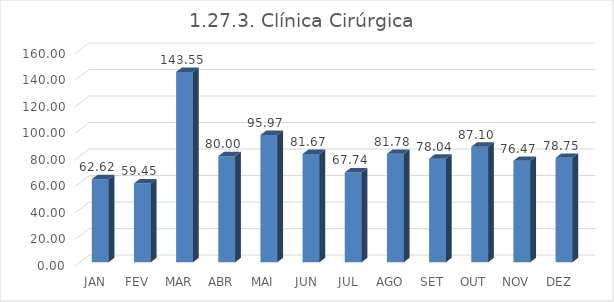
| Category | 1.27.3. Clínica Cirúrgica  |
|---|---|
|  JAN  | 62.619 |
|  FEV  | 59.454 |
|  MAR  | 143.548 |
|  ABR  | 80 |
|  MAI  | 95.968 |
|  JUN  | 81.667 |
|  JUL  | 67.742 |
|  AGO  | 81.784 |
|  SET  | 78.039 |
|  OUT  | 87.097 |
|  NOV  | 76.471 |
|  DEZ  | 78.748 |